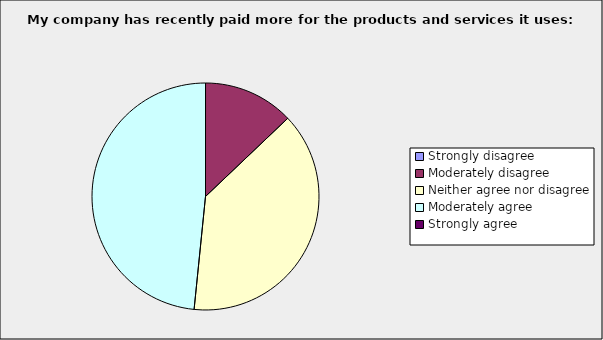
| Category | Series 0 |
|---|---|
| Strongly disagree | 0 |
| Moderately disagree | 0.129 |
| Neither agree nor disagree | 0.387 |
| Moderately agree | 0.484 |
| Strongly agree | 0 |